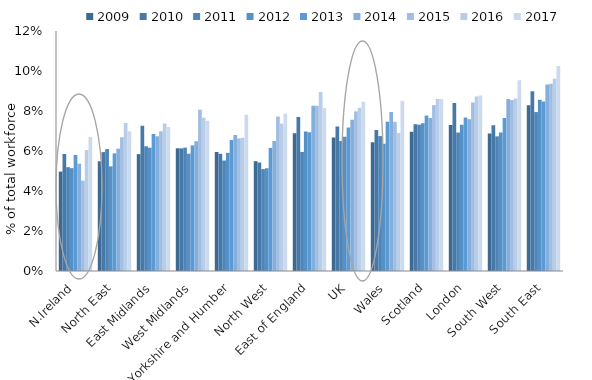
| Category | 2009 | 2010 | 2011 | 2012 | 2013 | 2014 | 2015 | 2016 | 2017 |
|---|---|---|---|---|---|---|---|---|---|
| N.Ireland | 0.05 | 0.059 | 0.052 | 0.051 | 0.058 | 0.054 | 0.045 | 0.06 | 0.067 |
| North East | 0.055 | 0.059 | 0.061 | 0.052 | 0.059 | 0.061 | 0.067 | 0.074 | 0.07 |
| East Midlands | 0.058 | 0.073 | 0.062 | 0.062 | 0.068 | 0.067 | 0.07 | 0.074 | 0.072 |
| West Midlands | 0.061 | 0.061 | 0.062 | 0.059 | 0.063 | 0.065 | 0.081 | 0.077 | 0.075 |
| Yorkshire and Humber | 0.06 | 0.059 | 0.055 | 0.059 | 0.066 | 0.068 | 0.066 | 0.067 | 0.078 |
| North West | 0.055 | 0.054 | 0.051 | 0.051 | 0.062 | 0.065 | 0.077 | 0.074 | 0.079 |
| East of England | 0.069 | 0.077 | 0.06 | 0.07 | 0.069 | 0.083 | 0.083 | 0.09 | 0.081 |
| UK | 0.067 | 0.072 | 0.065 | 0.067 | 0.072 | 0.076 | 0.08 | 0.082 | 0.085 |
| Wales | 0.064 | 0.07 | 0.067 | 0.064 | 0.075 | 0.079 | 0.075 | 0.069 | 0.085 |
| Scotland | 0.07 | 0.073 | 0.073 | 0.074 | 0.078 | 0.076 | 0.083 | 0.086 | 0.086 |
| London | 0.073 | 0.084 | 0.069 | 0.073 | 0.077 | 0.076 | 0.084 | 0.087 | 0.088 |
| South West | 0.069 | 0.073 | 0.067 | 0.069 | 0.077 | 0.086 | 0.085 | 0.086 | 0.095 |
| South East | 0.083 | 0.09 | 0.079 | 0.086 | 0.085 | 0.093 | 0.094 | 0.096 | 0.102 |